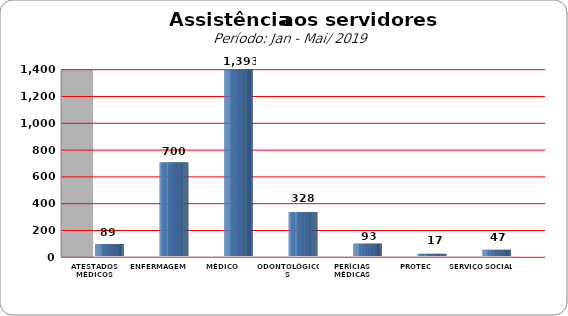
| Category | Series 0 |
|---|---|
| ATESTADOS MÉDICOS | 89 |
| ENFERMAGEM | 700 |
| MÉDICO | 1393 |
| ODONTOLÓGICOS | 328 |
| PERÍCIAS MÉDICAS | 93 |
| PROTEC | 17 |
| SERVIÇO SOCIAL | 47 |